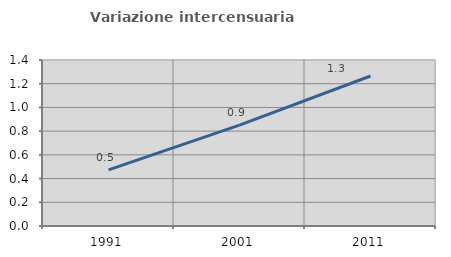
| Category | Variazione intercensuaria annua |
|---|---|
| 1991.0 | 0.474 |
| 2001.0 | 0.851 |
| 2011.0 | 1.265 |